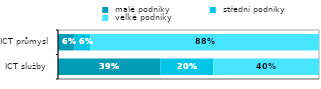
| Category |  malé podniky |  střední podniky |  velké podniky |
|---|---|---|---|
| ICT služby  | 0.392 | 0.204 | 0.404 |
| ICT průmysl | 0.064 | 0.059 | 0.877 |